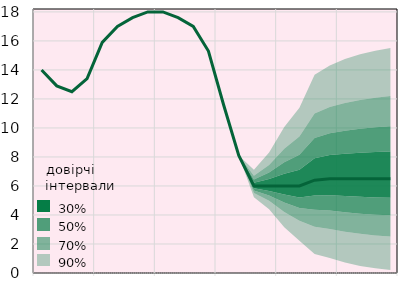
| Category | Series 8 | Series 11 |
|---|---|---|
|  | 14 |  |
|  | 12.9 |  |
|  | 12.5 |  |
| IV.17 | 13.4 |  |
|  | 15.9 |  |
|  | 17 |  |
|  | 17.6 |  |
| IV.18 | 18 |  |
|  | 18 |  |
|  | 17.6 |  |
|  | 17 |  |
| IV.19 | 15.3 |  |
|  | 11.6 |  |
|  | 8.1 |  |
|  | 6 |  |
| IV.20 | 6 |  |
|  | 6 |  |
|  | 6 |  |
|  | 6.4 |  |
| IV.21 | 6.5 |  |
|  | 6.5 |  |
|  | 6.5 |  |
|  | 6.5 |  |
| IV.22 | 6.5 |  |